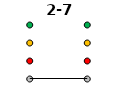
| Category | 0 | 1 | 2 | 3 | 2-7 |
|---|---|---|---|---|---|
| Time 1 | 0 | 1 | 2 | 3 | 0 |
| Time 2 | 0 | 1 | 2 | 3 | 0 |